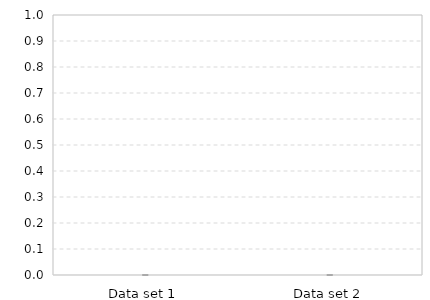
| Category | Series 0 | Series 1 | Series 2 | Series 3 | Series 4 |
|---|---|---|---|---|---|
| Data set 1 | 0 | 0 | 0 | 0 | 0 |
| Data set 2 | 0 | 0 | 0 | 0 | 0 |